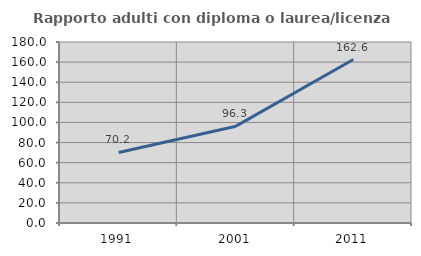
| Category | Rapporto adulti con diploma o laurea/licenza media  |
|---|---|
| 1991.0 | 70.175 |
| 2001.0 | 96.296 |
| 2011.0 | 162.559 |